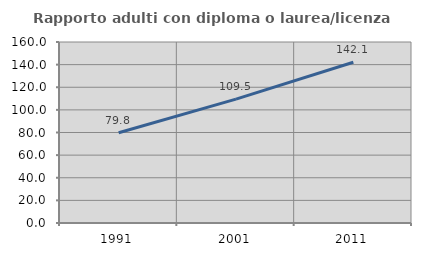
| Category | Rapporto adulti con diploma o laurea/licenza media  |
|---|---|
| 1991.0 | 79.755 |
| 2001.0 | 109.524 |
| 2011.0 | 142.051 |